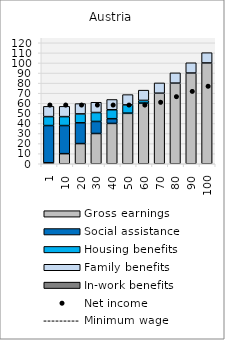
| Category | Gross earnings | Social assistance | Housing benefits | Family benefits | In-work benefits |
|---|---|---|---|---|---|
| 1.0 | 1 | 36.895 | 8.866 | 10.198 | 0 |
| 10.0 | 10 | 27.895 | 8.866 | 10.198 | 0 |
| 20.0 | 20 | 20.605 | 8.866 | 10.198 | 0 |
| 30.0 | 29.999 | 11.961 | 8.866 | 10.198 | 0 |
| 40.0 | 39.999 | 4.696 | 8.866 | 10.198 | 0 |
| 50.0 | 49.999 | 0.228 | 8.171 | 10.198 | 0 |
| 60.0 | 59.999 | 0.228 | 2.608 | 10.198 | 0 |
| 70.0 | 70.001 | 0 | 0 | 10.198 | 0 |
| 80.0 | 80 | 0 | 0 | 10.198 | 0 |
| 90.0 | 90 | 0 | 0 | 10.198 | 0 |
| 100.0 | 100 | 0 | 0 | 10.198 | 0 |